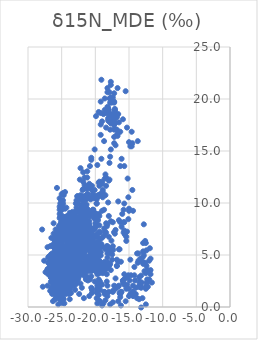
| Category | δ15N_MDE (‰) |
|---|---|
| -24.6 | 4.55 |
| -24.400000000000002 | 5.95 |
| -24.1 | 4.45 |
| -24.7 | 4.15 |
| -24.7 | 4.25 |
| -24.5 | 4.45 |
| -24.900000000000002 | 2.85 |
| -24.5 | 3.55 |
| -24.3 | 4.95 |
| -24.1 | 6.25 |
| -24.400000000000002 | 4.95 |
| -24.8 | 5.35 |
| -24.5 | 4.05 |
| -24.7 | 4.55 |
| -23.6 | 5.15 |
| -24.6 | 4.15 |
| -24.7 | 3.55 |
| -24.6 | 5.15 |
| -24.0 | 4.35 |
| -24.8 | 4.45 |
| -25.2 | 4.95 |
| -23.1 | 4.35 |
| -23.900000000000002 | 6.05 |
| -24.900000000000002 | 3.25 |
| -23.6 | 6.45 |
| -24.3 | 5.65 |
| -24.1 | 4.65 |
| -21.2 | 6.25 |
| -23.7 | 5.15 |
| -24.1 | 4.45 |
| -23.400000000000002 | 5.55 |
| -24.5 | 5.75 |
| -24.900000000000002 | 4.65 |
| -25.3 | 2.45 |
| -25.6 | 2.55 |
| -25.3 | 2.35 |
| -25.400000000000002 | 2.75 |
| -25.6 | 3.65 |
| -26.1 | 2.55 |
| -25.6 | 1.75 |
| -26.1 | 1.75 |
| -25.8 | 2.95 |
| -25.900000000000002 | 2.45 |
| -26.5 | 2.35 |
| -25.900000000000002 | 4.05 |
| -24.7 | 5.65 |
| -25.8 | 2.55 |
| -27.1 | 2.05 |
| -26.8 | 4.25 |
| -26.2 | 3.25 |
| -26.6 | 2.45 |
| -25.6 | 2.75 |
| -25.900000000000002 | 2.45 |
| -25.8 | 1.95 |
| -26.1 | 2.05 |
| -26.3 | 1.35 |
| -25.900000000000002 | 2.15 |
| -25.5 | 2.55 |
| -25.5 | 1.75 |
| -25.8 | 1.85 |
| -25.5 | 4.05 |
| -26.0 | 2.35 |
| -25.7 | 2.55 |
| -26.400000000000002 | 1.45 |
| -26.2 | 2.55 |
| -25.900000000000002 | 2.15 |
| -25.5 | 3.05 |
| -26.5 | 1.75 |
| -26.3 | 1.55 |
| -25.900000000000002 | 2.25 |
| -26.1 | 2.15 |
| -26.7 | 1.55 |
| -25.900000000000002 | 2.55 |
| -25.8 | 2.95 |
| -26.1 | 2.35 |
| -25.5 | 2.95 |
| -25.8 | 1.25 |
| -26.0 | 1.65 |
| -25.400000000000002 | 2.55 |
| -25.2 | 2.25 |
| -25.5 | 3.75 |
| -25.5 | 2.85 |
| -25.6 | 2.55 |
| -25.900000000000002 | 1.45 |
| -26.1 | 1.25 |
| -25.900000000000002 | 1.55 |
| -25.1 | 3.65 |
| -25.3 | 3.45 |
| -25.3 | 3.85 |
| -25.3 | 3.25 |
| -25.8 | 3.05 |
| -24.8 | 3.95 |
| -26.400000000000002 | 5.15 |
| -26.3 | 2.65 |
| -25.900000000000002 | 3.75 |
| -26.0 | 2.35 |
| -26.5 | 3.15 |
| -26.8 | 3.25 |
| -25.400000000000002 | 2.95 |
| -25.3 | 3.45 |
| -26.6 | 3.75 |
| -25.5 | 3.55 |
| -26.2 | 1.95 |
| -26.6 | 2.85 |
| -26.400000000000002 | 1.95 |
| -26.2 | 1.45 |
| -26.2 | 2.55 |
| -23.8 | 5.55 |
| -23.3 | 7.05 |
| -24.400000000000002 | 5.05 |
| -24.8 | 4.75 |
| -23.3 | 6.85 |
| -23.8 | 4.45 |
| -23.5 | 4.35 |
| -24.900000000000002 | 2.95 |
| -23.5 | 4.45 |
| -23.400000000000002 | 6.35 |
| -23.8 | 4.75 |
| -24.1 | 3.15 |
| -23.8 | 5.05 |
| -24.5 | 3.15 |
| -23.5 | 4.45 |
| -24.3 | 4.65 |
| -23.6 | 4.35 |
| -24.3 | 4.35 |
| -24.2 | 5.05 |
| -23.900000000000002 | 3.45 |
| -24.3 | 2.95 |
| -24.5 | 2.35 |
| -23.5 | 5.35 |
| -24.0 | 5.85 |
| -23.900000000000002 | 4.15 |
| -23.8 | 3.95 |
| -24.5 | 5.65 |
| -23.6 | 5.55 |
| -24.1 | 5.05 |
| -24.0 | 4.95 |
| -24.1 | 5.75 |
| -24.0 | 4.45 |
| -24.0 | 5.05 |
| -23.6 | 4.45 |
| -24.2 | 5.95 |
| -24.3 | 4.45 |
| -23.5 | 4.65 |
| -24.5 | 5.45 |
| -24.3 | 4.65 |
| -23.6 | 4.55 |
| -24.1 | 4.45 |
| -24.1 | 5.65 |
| -24.0 | 5.55 |
| -24.1 | 6.15 |
| -24.3 | 5.65 |
| -23.900000000000002 | 4.75 |
| -24.1 | 4.85 |
| -23.8 | 6.45 |
| -23.8 | 4.55 |
| -24.5 | 5.35 |
| -23.8 | 5.85 |
| -24.0 | 5.95 |
| -23.900000000000002 | 5.85 |
| -24.0 | 6.75 |
| -24.5 | 5.65 |
| -24.900000000000002 | 3.15 |
| -24.1 | 4.75 |
| -24.3 | 5.35 |
| -24.2 | 4.75 |
| -24.2 | 5.35 |
| -23.8 | 5.55 |
| -26.400000000000002 | 3.25 |
| -26.6 | 2.85 |
| -26.2 | 2.25 |
| -26.1 | 2.75 |
| -26.3 | 3.45 |
| -25.6 | 2.95 |
| -26.0 | 2.15 |
| -25.900000000000002 | 3.05 |
| -26.0 | 2.75 |
| -26.3 | 3.05 |
| -25.900000000000002 | 2.75 |
| -26.1 | 3.45 |
| -25.900000000000002 | 2.35 |
| -25.900000000000002 | 2.95 |
| -25.1 | 5.25 |
| -25.400000000000002 | 3.15 |
| -25.900000000000002 | 3.05 |
| -25.900000000000002 | 2.95 |
| -26.0 | 2.15 |
| -25.7 | 2.75 |
| -26.6 | 3.25 |
| -25.7 | 2.95 |
| -26.0 | 2.55 |
| -26.2 | 3.65 |
| -26.1 | 2.95 |
| -26.1 | 2.75 |
| -26.2 | 3.45 |
| -25.7 | 3.35 |
| -26.1 | 3.15 |
| -25.8 | 3.15 |
| -25.5 | 3.55 |
| -21.5 | 4.85 |
| -21.3 | 3.65 |
| -20.8 | 5.95 |
| -21.8 | 3.75 |
| -23.900000000000002 | 4.35 |
| -22.6 | 3.35 |
| -23.0 | 3.95 |
| -24.5 | 3.85 |
| -23.3 | 4.35 |
| -23.400000000000002 | 4.25 |
| -24.400000000000002 | 3.65 |
| -22.2 | 4.05 |
| -24.5 | 2.75 |
| -23.1 | 3.55 |
| -23.2 | 5.05 |
| -22.7 | 3.85 |
| -22.7 | 3.15 |
| -23.8 | 4.45 |
| -23.900000000000002 | 3.65 |
| -22.8 | 4.75 |
| -24.3 | 4.05 |
| -22.7 | 4.45 |
| -23.0 | 5.65 |
| -23.6 | 5.35 |
| -23.0 | 3.95 |
| -22.6 | 4.95 |
| -20.5 | 5.15 |
| -21.7 | 3.15 |
| -23.8 | 4.55 |
| -22.1 | 5.05 |
| -22.2 | 4.95 |
| -22.3 | 4.75 |
| -22.6 | 4.95 |
| -21.4 | 4.65 |
| -23.0 | 4.65 |
| -22.6 | 3.95 |
| -22.3 | 4.65 |
| -22.900000000000002 | 4.35 |
| -21.8 | 5.25 |
| -23.3 | 4.85 |
| -22.7 | 4.55 |
| -21.0 | 4.05 |
| -20.0 | 5.85 |
| -21.4 | 4.25 |
| -25.400000000000002 | 3.45 |
| -24.7 | 4.45 |
| -26.0 | 2.85 |
| -25.8 | 2.75 |
| -25.6 | 3.65 |
| -25.0 | 4.35 |
| -25.400000000000002 | 3.45 |
| -25.400000000000002 | 4.05 |
| -25.3 | 4.35 |
| -24.7 | 3.65 |
| -25.0 | 3.35 |
| -21.8 | 7.35 |
| -24.700000000000006 | 3.15 |
| -24.3 | 3.95 |
| -25.3 | 2.65 |
| -24.399999999999995 | 4.55 |
| -24.3 | 4.15 |
| -25.399999999999995 | 3.15 |
| -24.99999999999999 | 3.62 |
| -25.24 | 2.85 |
| -25.3 | 2.65 |
| -25.3 | 2.75 |
| -25.49999999999999 | 2.45 |
| -24.99999999999999 | 2.75 |
| -25.100000000000012 | 2.55 |
| -22.99999999999999 | 6.35 |
| -24.700000000000006 | 3.55 |
| -25.49999999999999 | 2.85 |
| -22.8 | 6.75 |
| -23.49999999999999 | 5.75 |
| -23.700000000000006 | 6.05 |
| -22.8 | 6.55 |
| -23.100000000000012 | 6.15 |
| -23.209999999999997 | 6.69 |
| -22.700000000000006 | 6.45 |
| -23.3 | 6.05 |
| -24.899999999999995 | 3.95 |
| -24.8 | 3.95 |
| -24.49999999999999 | 3.55 |
| -25.600000000000012 | 3.05 |
| -24.49999999999999 | 4.05 |
| -24.399999999999995 | 4.05 |
| -25.100000000000012 | 4.25 |
| -22.3 | 6.55 |
| -22.600000000000012 | 6.65 |
| -22.600000000000012 | 6.65 |
| -23.399999999999995 | 6.05 |
| -22.3 | 6.95 |
| -22.99999999999999 | 5.65 |
| -23.100000000000012 | 5.95 |
| -21.899999999999995 | 6.45 |
| -22.600000000000012 | 5.85 |
| -23.700000000000006 | 5.55 |
| -22.600000000000012 | 5.95 |
| -22.99999999999999 | 6.05 |
| -25.1 | 6.65 |
| -25.3 | 9.35 |
| -25.3 | 9.65 |
| -24.8 | 10.25 |
| -24.7 | 10.75 |
| -24.3 | 9.55 |
| -22.8 | 10.25 |
| -25.1 | 9.25 |
| -24.6 | 7.65 |
| -24.8 | 8.05 |
| -25.1 | 3.55 |
| -24.900000000000002 | 9.85 |
| -24.900000000000002 | 8.25 |
| -25.1 | 10.25 |
| -24.8 | 9.95 |
| -25.2 | 9.95 |
| -25.1 | 7.45 |
| -25.1 | 9.75 |
| -24.900000000000002 | 9.45 |
| -24.2 | 8.25 |
| -24.6 | 8.15 |
| -24.8 | 4.75 |
| -25.3 | 8.55 |
| -24.5 | 9.45 |
| -25.0 | 10.85 |
| -24.900000000000002 | 7.85 |
| -25.3 | 10.45 |
| -25.7 | 11.45 |
| -25.3 | 8.95 |
| -24.8 | 10.95 |
| -24.7 | 7.95 |
| -24.3 | 5.25 |
| -24.3 | 4.65 |
| -24.400000000000002 | 5.35 |
| -24.400000000000002 | 5.25 |
| -24.5 | 4.45 |
| -24.400000000000002 | 3.45 |
| -23.8 | 5.25 |
| -24.5 | 4.55 |
| -23.900000000000002 | 4.85 |
| -23.8 | 4.75 |
| -23.900000000000002 | 4.65 |
| -22.1 | 10.55 |
| -23.6 | 5.55 |
| -22.8 | 7.75 |
| -24.7 | 5.35 |
| -23.1 | 8.15 |
| -21.6 | 6.15 |
| -25.6 | 3.65 |
| -23.900000000000002 | 5.45 |
| -22.400000000000002 | 6.05 |
| -23.5 | 4.25 |
| -24.6 | 4.05 |
| -25.1 | 4.95 |
| -25.0 | 4.75 |
| -24.6 | 4.25 |
| -25.0 | 4.75 |
| -24.2 | 4.45 |
| -21.6 | 5.45 |
| -23.1 | 6.15 |
| -24.6 | 4.45 |
| -23.400000000000002 | 4.55 |
| -24.400000000000002 | 3.85 |
| -24.1 | 3.25 |
| -24.900000000000002 | 4.25 |
| -24.8 | 5.15 |
| -24.3 | 4.95 |
| -24.6 | 5.35 |
| -24.7 | 4.65 |
| -22.1 | 5.75 |
| -21.0 | 6.25 |
| -22.400000000000002 | 5.95 |
| -22.5 | 5.95 |
| -22.7 | 5.95 |
| -21.6 | 5.65 |
| -23.400000000000002 | 8.45 |
| -22.900000000000002 | 7.35 |
| -23.7 | 6.15 |
| -20.0 | 4.95 |
| -24.0 | 5.15 |
| -23.900000000000002 | 5.65 |
| -23.900000000000002 | 5.25 |
| -24.2 | 4.45 |
| -24.3 | 5.25 |
| -25.1 | 3.25 |
| -23.1 | 5.55 |
| -24.1 | 4.25 |
| -24.5 | 2.35 |
| -24.6 | 1.95 |
| -24.2 | 5.55 |
| -24.7 | 4.05 |
| -24.3 | 5.25 |
| -24.6 | 5.05 |
| -22.6 | 4.55 |
| -23.900000000000002 | 5.25 |
| -24.900000000000002 | 3.05 |
| -24.3 | 4.85 |
| -24.5 | 11.05 |
| -24.3 | 3.35 |
| -24.900000000000002 | 1.85 |
| -24.400000000000002 | 3.15 |
| -25.6 | 2.45 |
| -24.400000000000002 | 3.05 |
| -24.400000000000002 | 2.35 |
| -24.900000000000002 | 2.25 |
| -24.900000000000002 | 2.05 |
| -24.400000000000002 | 2.55 |
| -24.1 | 2.55 |
| -24.6 | 2.45 |
| -24.5 | 1.75 |
| -24.6 | 1.45 |
| -24.7 | 2.45 |
| -24.900000000000002 | 1.45 |
| -25.3 | 1.15 |
| -24.8 | 2.05 |
| -24.5 | 2.65 |
| -25.3 | 1.05 |
| -24.5 | 2.55 |
| -24.5 | 3.15 |
| -24.6 | 3.15 |
| -24.3 | 2.05 |
| -24.3 | 2.05 |
| -24.6 | 2.85 |
| -24.400000000000002 | 2.95 |
| -24.2 | 2.15 |
| -24.7 | 2.55 |
| -24.2 | 2.05 |
| -24.6 | 1.85 |
| -23.900000000000002 | 2.85 |
| -24.5 | 3.05 |
| -24.2 | 3.35 |
| -24.6 | 2.55 |
| -25.0 | 1.45 |
| -25.2 | 1.15 |
| -25.1 | 0.85 |
| -24.3 | 2.35 |
| -25.0 | 0.85 |
| -24.900000000000002 | 1.55 |
| -24.900000000000002 | 1.45 |
| -24.7 | 1.35 |
| -24.2 | 1.65 |
| -24.900000000000002 | 1.35 |
| -25.0 | 1.05 |
| -25.1 | 1.95 |
| -24.900000000000002 | 1.65 |
| -24.2 | 3.25 |
| -25.983 | 0.732 |
| -25.888 | 0.822 |
| -24.914 | 0.397 |
| -25.689 | 1.029 |
| -25.707 | 1.113 |
| -25.595000000000002 | 1.122 |
| -25.71 | 1.304 |
| -25.715 | 1.376 |
| -25.684 | 1.447 |
| -25.607 | 1.526 |
| -25.603 | 1.414 |
| -25.802 | 1.637 |
| -25.416 | 2.223 |
| -25.7 | 2.323 |
| -25.201 | 2.51 |
| -25.121000000000002 | 3.051 |
| -25.017 | 3.157 |
| -25.021 | 3.372 |
| -25.012 | 3.444 |
| -24.797 | 3.354 |
| -24.797 | 3.465 |
| -24.921 | 3.651 |
| -24.702 | 3.656 |
| -24.609 | 3.656 |
| -24.698 | 3.877 |
| -24.709 | 3.95 |
| -25.098 | 3.775 |
| -25.112000000000002 | 3.866 |
| -25.024 | 3.864 |
| -25.01 | 4.075 |
| -24.918 | 4.241 |
| -24.605 | 4.256 |
| -24.712 | 4.577 |
| -24.61 | 4.87 |
| -24.413 | 4.765 |
| -24.918 | 4.963 |
| -24.92 | 5.343 |
| -24.793 | 5.566 |
| -24.705000000000002 | 5.469 |
| -24.503 | 5.67 |
| -25.119 | 6.579 |
| -25.21 | 6.872 |
| -25.305 | 7.85 |
| -25.106 | 7.593 |
| -24.91 | 7.584 |
| -24.007 | 7.763 |
| -24.425 | 8.564 |
| -25.21 | 8.683 |
| -24.87 | 4.85 |
| -25.41 | 3.04 |
| -25.580000000000002 | 2.56 |
| -23.68 | 6.1 |
| -25.51 | 4.29 |
| -25.27 | 4.15 |
| -25.44 | 4.45 |
| -25.29 | 4.28 |
| -24.470000000000002 | 4.78 |
| -25.240000000000002 | 5.03 |
| -25.18 | 5.74 |
| -25.25 | 5.13 |
| -25.91 | 3.6 |
| -25.32 | 4.22 |
| -25.77 | 4.03 |
| -25.51 | 5.22 |
| -26.14 | 2.76 |
| -25.560000000000002 | 2.83 |
| -25.66 | 2.91 |
| -25.25 | 4.18 |
| -26.29 | 0.56 |
| -25.29 | 5.43 |
| -25.86 | 2.22 |
| -26.240000000000002 | 2.77 |
| -26.14 | 1.97 |
| -24.970000000000002 | 5.24 |
| -25.970000000000002 | 2.91 |
| -26.27 | 2.38 |
| -25.14 | 3.99 |
| -25.57 | 3.49 |
| -24.95 | 5.72 |
| -26.14 | 4.86 |
| -25.32 | 3.66 |
| -26.55 | -1.97 |
| -26.73 | -1.44 |
| -25.13 | 2.99 |
| -25.32 | 2.72 |
| -25.54 | 2.11 |
| -25.67 | 2.72 |
| -24.810000000000002 | 3.09 |
| -25.04 | 3.14 |
| -25.21 | 1.98 |
| -25.89 | 1.55 |
| -25.5 | 3.61 |
| -24.5 | 3.38 |
| -25.39 | 1.78 |
| -25.14 | 3 |
| -25.05 | 3.24 |
| -25.560000000000002 | 3.72 |
| -25.25 | 3.42 |
| -25.5 | 2.23 |
| -26.95 | -1.07 |
| -25.29 | 2.05 |
| -25.38 | 2.96 |
| -25.2 | 4.42 |
| -25.810000000000002 | 3.25 |
| -24.98 | 3.2 |
| -25.53 | 2.16 |
| -25.66 | 3.69 |
| -24.95 | 3.98 |
| -24.94 | 3.6 |
| -25.16 | 4.18 |
| -25.62 | 2.57 |
| -24.990000000000002 | 3.28 |
| -25.17 | 3.27 |
| -25.45 | 3.37 |
| -25.19 | 3.43 |
| -25.23 | 2.57 |
| -25.6 | 3.05 |
| -25.2 | 4.45 |
| -25.7 | 3.35 |
| -25.5 | 3.15 |
| -25.6 | 3.35 |
| -25.1 | 2.95 |
| -25.1 | 3.05 |
| -24.900000000000002 | 3.05 |
| -25.3 | 3.25 |
| -25.7 | 4.25 |
| -25.400000000000002 | 3.65 |
| -25.0 | 2.95 |
| -25.2 | 2.85 |
| -25.5 | 2.65 |
| -24.8 | 3.95 |
| -25.1 | 2.55 |
| -24.3 | 2.75 |
| -24.7 | 3.75 |
| -24.7 | 3.35 |
| -23.6 | 2.05 |
| -24.3 | 2.35 |
| -23.7 | 2.75 |
| -23.2 | 2.55 |
| -25.1 | 5.75 |
| -24.7 | 2.25 |
| -24.900000000000002 | 3.65 |
| -23.7 | 2.05 |
| -24.400000000000002 | 2.05 |
| -23.3 | 3.65 |
| -22.7 | 4.05 |
| -22.1 | 4.25 |
| -23.400000000000002 | 4.05 |
| -22.6 | 3.95 |
| -23.900000000000002 | 3.25 |
| -24.2 | 3.65 |
| -23.8 | 4.75 |
| -22.3 | 3.95 |
| -24.3 | 3.85 |
| -23.1 | 3.75 |
| -22.8 | 4.25 |
| -24.1 | 2.75 |
| -23.1 | 2.85 |
| -26.8 | 4.35 |
| -23.0 | 3.85 |
| -22.0 | 3.55 |
| -22.5 | 4.55 |
| -23.5 | 3.85 |
| -23.900000000000002 | 3.75 |
| -24.1 | 3.45 |
| -22.7 | 2.95 |
| -24.3 | 2.75 |
| -22.7 | 3.05 |
| -23.3 | 3.45 |
| -23.5 | 3.25 |
| -25.2 | 2.35 |
| -25.6 | 2.35 |
| -25.2 | 2.75 |
| -22.900000000000002 | 2.85 |
| -25.1 | 2.95 |
| -25.2 | 1.05 |
| -25.7 | 2.35 |
| -25.2 | 2.75 |
| -25.3 | 2.45 |
| -25.1 | 2.85 |
| -25.1 | 2.45 |
| -23.3 | 3.05 |
| -25.400000000000002 | 3.75 |
| -24.900000000000002 | 4.15 |
| -24.900000000000002 | 3.95 |
| -23.6 | 2.95 |
| -25.0 | 2.45 |
| -24.1 | 2.45 |
| -25.0 | 2.75 |
| -24.5 | 3.15 |
| -25.1 | 2.65 |
| -24.8 | 4.65 |
| -25.400000000000002 | 2.05 |
| -23.6 | 3.65 |
| -23.7 | 1.75 |
| -23.1 | 3.75 |
| -24.2 | 3.35 |
| -23.900000000000002 | 3.55 |
| -23.5 | 4.05 |
| -23.8 | 2.65 |
| -24.2 | 2.95 |
| -23.900000000000002 | 2.25 |
| -24.400000000000002 | 3.35 |
| -24.5 | 2.85 |
| -24.2 | 3.85 |
| -24.2 | 2.65 |
| -24.1 | 3.75 |
| -26.3 | 4.15 |
| -24.7 | 4.05 |
| -22.1 | 4.25 |
| -22.5 | 2.85 |
| -25.0 | 5.05 |
| -24.900000000000002 | 5.25 |
| -24.7 | 4.15 |
| -24.3 | 5.45 |
| -22.0 | 4.05 |
| -22.3 | 3.45 |
| -16.8 | 3.95 |
| -23.8 | 4.55 |
| -22.400000000000002 | 4.75 |
| -21.4 | 2.75 |
| -24.6 | 3.15 |
| -22.3 | 3.05 |
| -24.6 | -0.45 |
| -24.5 | 1.85 |
| -25.1 | 2.75 |
| -24.8 | 1.35 |
| -24.1 | 2.25 |
| -25.3 | 2.25 |
| -25.2 | 0.65 |
| -23.900000000000002 | 3.25 |
| -24.900000000000002 | 1.95 |
| -24.8 | 5.45 |
| -25.0 | 1.35 |
| -25.2 | 1.75 |
| -24.6 | 4.55 |
| -23.900000000000002 | 2.65 |
| -25.1 | 1.45 |
| -25.1 | 2.85 |
| -25.400000000000002 | 1.55 |
| -25.1 | 1.35 |
| -24.0 | 1.75 |
| -25.2 | 1.25 |
| -24.8 | 2.05 |
| -25.1 | 3.85 |
| -22.7 | 5.05 |
| -25.400000000000002 | 2.35 |
| -24.5 | -0.25 |
| -23.7 | 3.25 |
| -24.8 | 0.85 |
| -24.900000000000002 | 1.95 |
| -24.5 | 3.45 |
| -24.900000000000002 | 1.25 |
| -25.0 | 5.65 |
| -25.1 | 2.75 |
| -25.0 | 1.85 |
| -25.0 | 2.25 |
| -25.0 | 1.75 |
| -25.0 | 3.35 |
| -25.0 | 5.15 |
| -25.2 | 2.25 |
| -25.3 | 2.35 |
| -24.5 | 2.45 |
| -24.900000000000002 | 1.85 |
| -25.8 | 3.35 |
| -24.8 | 2.95 |
| -25.2 | 2.35 |
| -25.0 | 1.75 |
| -25.5 | 1.55 |
| -25.5 | 2.05 |
| -24.6 | 3.25 |
| -23.6 | 4.05 |
| -23.900000000000002 | 3.65 |
| -24.6 | 3.55 |
| -24.1 | 3.15 |
| -24.2 | 3.25 |
| -24.1 | 3.75 |
| -24.3 | 3.55 |
| -24.0 | 3.15 |
| -23.7 | 4.05 |
| -23.8 | 3.25 |
| -24.1 | 3.35 |
| -24.0 | 3.35 |
| -23.7 | 3.25 |
| -24.0 | 3.45 |
| -24.0 | 3.65 |
| -24.3 | 3.15 |
| -24.2 | 3.75 |
| -23.900000000000002 | 3.35 |
| -24.1 | 3.85 |
| -24.5 | 3.45 |
| -23.8 | 3.75 |
| -23.6 | 3.45 |
| -23.900000000000002 | 3.25 |
| -24.0 | 3.35 |
| -23.8 | 3.05 |
| -24.1 | 3.85 |
| -24.3 | 3.45 |
| -25.5 | 2.85 |
| -25.1 | 1.45 |
| -24.0 | 4.35 |
| -24.8 | 3.55 |
| -23.400000000000002 | 7.15 |
| -24.1 | 2.15 |
| -25.2 | 1.55 |
| -24.400000000000002 | 3.75 |
| -24.8 | 3.55 |
| -25.8 | 2.25 |
| -25.400000000000002 | 2.25 |
| -24.7 | 2.85 |
| -24.8 | 1.65 |
| -24.400000000000002 | 2.95 |
| -24.400000000000002 | 3.15 |
| -25.0 | 1.85 |
| -25.1 | 2.85 |
| -25.0 | 2.35 |
| -24.900000000000002 | 3.15 |
| -25.0 | 2.85 |
| -24.5 | 3.15 |
| -23.900000000000002 | 2.65 |
| -25.0 | 3.25 |
| -24.6 | 2.55 |
| -24.6 | 2.95 |
| -24.8 | 2.35 |
| -23.8 | 3.55 |
| -24.5 | 3.65 |
| -24.8 | 2.15 |
| -24.400000000000002 | 2.45 |
| -24.5 | 2.45 |
| -24.400000000000002 | 2.25 |
| -24.900000000000002 | 2.55 |
| -24.400000000000002 | 1.25 |
| -24.6 | 2.35 |
| -24.8 | 2.95 |
| -24.5 | 3.35 |
| -24.400000000000002 | 3.45 |
| -24.3 | 4.55 |
| -24.5 | 2.85 |
| -24.0 | 4.85 |
| -24.7 | 2.15 |
| -24.900000000000002 | 2.95 |
| -24.900000000000002 | 2.75 |
| -24.900000000000002 | 3.05 |
| -24.900000000000002 | 2.65 |
| -24.7 | 2.55 |
| -25.0 | 1.75 |
| -25.2 | 2.55 |
| -24.2 | 4.05 |
| -24.8 | 2.45 |
| -25.1 | 2.75 |
| -25.0 | 4.65 |
| -24.3 | 3.05 |
| -24.900000000000002 | 2.15 |
| -24.5 | 4.75 |
| -24.5 | 4.65 |
| -24.7 | 3.55 |
| -25.2 | 2.85 |
| -25.0 | 3.45 |
| -25.3 | 3.15 |
| -24.7 | 2.45 |
| -25.1 | 3.05 |
| -25.3 | 3.35 |
| -25.3 | 3.05 |
| -24.6 | 3.75 |
| -25.2 | 2.85 |
| -14.8 | 1.25 |
| -14.399999999999999 | 1.05 |
| -13.5 | 0.75 |
| -13.1 | 2.35 |
| -14.0 | 1.25 |
| -13.399999999999999 | 1.95 |
| -12.5 | 0.25 |
| -12.5 | -0.25 |
| -13.0 | -0.45 |
| -12.899999999999999 | -0.35 |
| -14.399999999999999 | -0.45 |
| -11.8 | 3.55 |
| -12.3 | 2.65 |
| -13.8 | 0.85 |
| -19.5 | 0.65 |
| -11.6 | 2.35 |
| -12.5 | 1.75 |
| -16.2 | 4.35 |
| -12.6 | 6.35 |
| -14.8 | 4.55 |
| -12.899999999999999 | 5.35 |
| -12.8 | 7.95 |
| -12.1 | 2.45 |
| -13.399999999999999 | 2.25 |
| -14.0 | 1.85 |
| -14.899999999999999 | 2.55 |
| -13.399999999999999 | 2.45 |
| -15.899999999999999 | 2.35 |
| -15.0 | 1.75 |
| -11.8 | 4.65 |
| -12.2 | 1.95 |
| -12.399999999999999 | 2.05 |
| -14.399999999999999 | 2.05 |
| -13.6 | 1.95 |
| -13.0 | 0.85 |
| -12.0 | 2.65 |
| -24.0 | 6.65 |
| -24.2 | 6.65 |
| -23.0 | 5.65 |
| -22.799999999999997 | 5.05 |
| -23.299999999999997 | 5.55 |
| -23.099999999999998 | 5.65 |
| -19.2 | 5.85 |
| -19.4 | 5.85 |
| -21.2 | 4.25 |
| -21.299999999999997 | 4.35 |
| -19.2 | 4.95 |
| -19.8 | 4.75 |
| -19.5 | 5.65 |
| -19.8 | 5.45 |
| -20.0 | 4.95 |
| -19.599999999999998 | 5.35 |
| -19.9 | 4.95 |
| -19.599999999999998 | 4.85 |
| -20.0 | 5.05 |
| -19.8 | 4.95 |
| -20.2 | 4.75 |
| -19.9 | 4.45 |
| -21.0 | 4.65 |
| -20.799999999999997 | 4.55 |
| -19.9 | 5.55 |
| -17.4 | 5.55 |
| -17.4 | 5.85 |
| -19.7 | 4.55 |
| -19.3 | 4.35 |
| -17.9 | 5.65 |
| -18.3 | 5.85 |
| -23.0 | 5.25 |
| -23.0 | 5.65 |
| -23.0 | 6.05 |
| -23.099999999999998 | 6.55 |
| -22.299999999999997 | 6.15 |
| -25.0 | 3.75 |
| -26.2 | 3.45 |
| -24.6 | 2.75 |
| -26.7 | 3.55 |
| -25.6 | 3.15 |
| -24.2 | 5.25 |
| -25.2 | 3.05 |
| -26.0 | 4.65 |
| -26.7 | 4.05 |
| -27.0 | 4.75 |
| -25.400000000000002 | 3.75 |
| -25.2 | 4.45 |
| -25.5 | 3.15 |
| -25.2 | 3.05 |
| -26.1 | 4.05 |
| -25.400000000000002 | 4.05 |
| -25.1 | 4.15 |
| -25.1 | 5.75 |
| -27.400000000000002 | 3.35 |
| -25.3 | 3.75 |
| -25.1 | 2.45 |
| -25.3 | 2.75 |
| -25.400000000000002 | 4.55 |
| -25.6 | 3.95 |
| -26.400000000000002 | 4.45 |
| -25.8 | 3.55 |
| -26.0 | 3.25 |
| -25.2 | 2.75 |
| -23.6 | 4.45 |
| -24.900000000000002 | 3.85 |
| -25.7 | 3.55 |
| -25.3 | 3.45 |
| -25.3 | 3.65 |
| -25.2 | 4.05 |
| -25.2 | 2.05 |
| -25.6 | 3.15 |
| -25.8 | 2.15 |
| -25.5 | 3.15 |
| -25.400000000000002 | 2.75 |
| -25.3 | 2.75 |
| -25.0 | 1.25 |
| -25.400000000000002 | 3.15 |
| -25.6 | 1.85 |
| -25.5 | 1.85 |
| -25.3 | 2.55 |
| -25.2 | 2.95 |
| -24.5 | 3.15 |
| -25.400000000000002 | 3.75 |
| -25.3 | 3.25 |
| -26.1 | 2.55 |
| -25.1 | 3.55 |
| -25.400000000000002 | 2.85 |
| -25.8 | 2.45 |
| -24.900000000000002 | 2.85 |
| -24.8 | 5.15 |
| -25.7 | 2.55 |
| -25.3 | 2.65 |
| -25.900000000000002 | 3.35 |
| -25.400000000000002 | 2.65 |
| -25.5 | 3.45 |
| -25.900000000000002 | 3.25 |
| -26.1 | 3.35 |
| -27.0 | 4.25 |
| -25.0 | 4.85 |
| -25.400000000000002 | 2.65 |
| -26.2 | 4.55 |
| -25.2 | 2.75 |
| -26.8 | 3.65 |
| -25.7 | 3.15 |
| -25.7 | 2.95 |
| -25.400000000000002 | 3.85 |
| -25.6 | 6.35 |
| -25.5 | 3.25 |
| -26.900000000000002 | 4.25 |
| -25.7 | 2.35 |
| -25.6 | 3.45 |
| -27.1 | 3.55 |
| -25.0 | 2.35 |
| -25.900000000000002 | 3.75 |
| -26.400000000000002 | 3.85 |
| -25.0 | 3.45 |
| -26.3 | 3.25 |
| -26.1 | 1.75 |
| -25.400000000000002 | 3.25 |
| -25.3 | 3.75 |
| -27.0 | 3.15 |
| -25.3 | 2.75 |
| -26.3 | 3.05 |
| -25.5 | 2.05 |
| -25.1 | 1.95 |
| -25.5 | 6.15 |
| -25.8 | 2.35 |
| -25.7 | 2.95 |
| -25.2 | 2.85 |
| -25.900000000000002 | 1.45 |
| -25.2 | 3.25 |
| -25.5 | 4.25 |
| -25.6 | 1.55 |
| -26.5 | 4.65 |
| -25.8 | 4.55 |
| -25.5 | 3.45 |
| -25.6 | 2.85 |
| -25.2 | 3.85 |
| -25.400000000000002 | 3.45 |
| -26.2 | 3.65 |
| -24.900000000000002 | 3.65 |
| -25.900000000000002 | 2.85 |
| -25.400000000000002 | 2.65 |
| -25.7 | 2.75 |
| -26.3 | 3.25 |
| -26.7 | 3.05 |
| -25.900000000000002 | 1.95 |
| -25.900000000000002 | 2.45 |
| -25.400000000000002 | 2.45 |
| -25.3 | 3.15 |
| -25.5 | 3.55 |
| -25.900000000000002 | 1.65 |
| -25.7 | 2.25 |
| -25.3 | 5.25 |
| -25.6 | 3.75 |
| -25.7 | 2.95 |
| -26.0 | 3.65 |
| -25.400000000000002 | 2.15 |
| -25.5 | 2.55 |
| -27.0 | 3.65 |
| -25.0 | 4.55 |
| -25.6 | 3.55 |
| -25.400000000000002 | 3.35 |
| -25.400000000000002 | 3.65 |
| -25.7 | 3.35 |
| -25.400000000000002 | 4.15 |
| -25.400000000000002 | 3.45 |
| -25.400000000000002 | 3.75 |
| -27.6 | 4.45 |
| -24.400000000000002 | 4.55 |
| -25.2 | 4.25 |
| -25.6 | 3.55 |
| -26.5 | 4.25 |
| -25.6 | 5.25 |
| -25.7 | 3.55 |
| -25.3 | 2.65 |
| -26.0 | 2.95 |
| -25.3 | 3.35 |
| -25.6 | 3.25 |
| -25.5 | 4.45 |
| -25.6 | 2.95 |
| -26.2 | 3.75 |
| -25.6 | 3.15 |
| -25.400000000000002 | 2.65 |
| -26.0 | 4.35 |
| -26.2 | 4.45 |
| -25.5 | 4.55 |
| -23.400000000000002 | 7.85 |
| -24.8 | 3.95 |
| -26.0 | 3.55 |
| -25.400000000000002 | 3.35 |
| -24.900000000000002 | 1.95 |
| -25.5 | 3.65 |
| -25.5 | 3.95 |
| -26.7 | 4.05 |
| -24.8 | 3.55 |
| -24.8 | 4.95 |
| -24.8 | 3.95 |
| -25.8 | 3.95 |
| -25.8 | 3.95 |
| -25.400000000000002 | 3.95 |
| -26.1 | 2.85 |
| -25.8 | 2.65 |
| -25.400000000000002 | 1.75 |
| -25.3 | 3.85 |
| -25.7 | 3.15 |
| -25.7 | 2.95 |
| -27.1 | 3.65 |
| -25.400000000000002 | 4.65 |
| -26.1 | 3.25 |
| -25.400000000000002 | 2.75 |
| -25.7 | 3.15 |
| -26.0 | 3.25 |
| -26.0 | 4.65 |
| -25.2 | 5.15 |
| -26.1 | 2.85 |
| -26.1 | 2.45 |
| -26.5 | 1.75 |
| -26.3 | 2.95 |
| -25.0 | 3.85 |
| -25.3 | 4.15 |
| -25.0 | 1.95 |
| -24.900000000000002 | 5.75 |
| -24.900000000000002 | 5.75 |
| -26.0 | 3.15 |
| -25.400000000000002 | 3.85 |
| -25.7 | 2.45 |
| -26.3 | 4.45 |
| -26.400000000000002 | 3.55 |
| -25.400000000000002 | 4.75 |
| -25.1 | 3.75 |
| -25.6 | 3.35 |
| -25.5 | 3.15 |
| -26.6 | 3.25 |
| -25.1 | 2.45 |
| -25.8 | 3.95 |
| -25.2 | 5.65 |
| -25.400000000000002 | 4.25 |
| -27.2 | -0.15 |
| -26.0 | 3.65 |
| -17.9 | 13.85 |
| -18.6 | 12.35 |
| -20.1 | 9.05 |
| -20.4 | 9.35 |
| -19.5 | 11.95 |
| -20.5 | 9.15 |
| -19.3 | 10.85 |
| -18.4 | 12.45 |
| -18.5 | 12.75 |
| -20.1 | 15.15 |
| -19.4 | 11.65 |
| -19.6 | 10.75 |
| -20.3 | 9.35 |
| -18.9 | 11.05 |
| -18.9 | 10.55 |
| -21.2 | 9.35 |
| -22.2 | 8.05 |
| -20.6 | 9.05 |
| -15.399999999999999 | 6.35 |
| -20.5 | 7.25 |
| -13.6 | 4.45 |
| -22.900000000000002 | 3.75 |
| -22.900000000000002 | 7.55 |
| -21.900000000000002 | 8.55 |
| -20.1 | 7.65 |
| -20.2 | 8.55 |
| -21.3 | 8.75 |
| -20.7 | 10.45 |
| -13.8 | 5.15 |
| -20.2 | 6.85 |
| -19.8 | 8.75 |
| -24.900000000000002 | 5.85 |
| -26.900000000000002 | 4.85 |
| -21.2 | 9.45 |
| -21.3 | 8.75 |
| -20.7 | 10.35 |
| -21.6 | 8.55 |
| -20.3 | 8.95 |
| -21.5 | 8.95 |
| -22.6 | 6.65 |
| -19.5 | 6.25 |
| -21.900000000000002 | 5.65 |
| -22.3 | 5.05 |
| -22.5 | 6.15 |
| -21.7 | 6.85 |
| -22.2 | 7.05 |
| -22.2 | 6.35 |
| -22.0 | 7.15 |
| -22.7 | 2.65 |
| -22.400000000000002 | 6.35 |
| -22.0 | 6.55 |
| -18.6 | 3.55 |
| -14.399999999999999 | 1.45 |
| -22.0 | 8.05 |
| -21.8 | 6.25 |
| -22.7 | 6.45 |
| -22.400000000000002 | 7.35 |
| -22.5 | 6.65 |
| -22.400000000000002 | 6.15 |
| -22.5 | 3.85 |
| -19.7 | 5.85 |
| -21.7 | 8.05 |
| -24.6 | 3.85 |
| -18.2 | 7.95 |
| -22.0 | 5.25 |
| -16.3 | 1.25 |
| -22.0 | 4.75 |
| -22.0 | 6.35 |
| -22.2 | 6.35 |
| -22.2 | 6.55 |
| -19.9 | 5.65 |
| -23.400000000000002 | 6.05 |
| -22.6 | 5.85 |
| -22.5 | 7.35 |
| -22.3 | 6.65 |
| -19.9 | 5.15 |
| -21.8 | 6.55 |
| -21.8 | 6.75 |
| -15.899999999999999 | 2.55 |
| -19.9 | 4.45 |
| -21.6 | 6.25 |
| -22.3 | 5.15 |
| -21.4 | 7.65 |
| -20.0 | 5.95 |
| -22.900000000000002 | 6.15 |
| -21.1 | 6.75 |
| -21.0 | 7.95 |
| -22.0 | 6.55 |
| -20.7 | 7.25 |
| -22.5 | 6.25 |
| -22.6 | 6.15 |
| -21.4 | 6.45 |
| -22.0 | 6.65 |
| -22.0 | 6.15 |
| -22.6 | 5.55 |
| -22.5 | 5.85 |
| -21.900000000000002 | 7.85 |
| -22.2 | 7.65 |
| -22.8 | 5.25 |
| -21.7 | 6.45 |
| -20.5 | 4.35 |
| -21.8 | 6.45 |
| -22.2 | 6.85 |
| -22.2 | 6.95 |
| -20.9 | 1.05 |
| -15.0 | 1.05 |
| -21.900000000000002 | 8.15 |
| -19.9 | 4.65 |
| -22.900000000000002 | 5.45 |
| -21.8 | 7.35 |
| -22.400000000000002 | 5.75 |
| -21.900000000000002 | 5.45 |
| -21.6 | 5.85 |
| -22.6 | 6.35 |
| -25.3 | 2.85 |
| -20.6 | 6.95 |
| -21.6 | 5.95 |
| -16.2 | 0.15 |
| -21.8 | 5.05 |
| -21.7 | 7.05 |
| -22.3 | 6.15 |
| -22.400000000000002 | 6.75 |
| -19.7 | 6.25 |
| -23.5 | 5.55 |
| -23.5 | 4.25 |
| -21.900000000000002 | 6.85 |
| -23.0 | 5.35 |
| -20.9 | 6.55 |
| -21.7 | 7.15 |
| -22.400000000000002 | 4.05 |
| -18.1 | 5.75 |
| -22.3 | 5.85 |
| -22.400000000000002 | 4.95 |
| -21.900000000000002 | 4.05 |
| -20.9 | 6.65 |
| -20.4 | 5.65 |
| -24.1 | 4.15 |
| -19.8 | 4.85 |
| -20.7 | 7.25 |
| -22.6 | 6.45 |
| -21.7 | 6.75 |
| -22.3 | 5.05 |
| -24.6 | 6.65 |
| -21.7 | 6.85 |
| -22.2 | 6.35 |
| -22.0 | 7.15 |
| -22.7 | 2.65 |
| -22.400000000000002 | 6.35 |
| -22.0 | 6.55 |
| -18.6 | 3.55 |
| -14.399999999999999 | 1.45 |
| -22.0 | 8.05 |
| -21.8 | 6.25 |
| -22.400000000000002 | 7.35 |
| -22.5 | 3.85 |
| -19.7 | 5.85 |
| -24.6 | 3.85 |
| -16.3 | 1.25 |
| -22.0 | 4.75 |
| -19.9 | 5.65 |
| -23.400000000000002 | 6.05 |
| -22.6 | 5.85 |
| -22.5 | 7.35 |
| -19.9 | 5.15 |
| -21.8 | 6.55 |
| -21.8 | 6.75 |
| -15.899999999999999 | 2.55 |
| -21.6 | 6.25 |
| -22.3 | 5.15 |
| -20.0 | 5.95 |
| -21.1 | 6.75 |
| -21.0 | 7.95 |
| -21.7 | 8.05 |
| -21.4 | 7.65 |
| -22.900000000000002 | 6.15 |
| -20.7 | 7.25 |
| -25.1 | 8.15 |
| -21.2 | 9.35 |
| -21.1 | 7.65 |
| -24.400000000000002 | 6.85 |
| -20.1 | 7.45 |
| -25.1 | 7.85 |
| -23.5 | 8.05 |
| -24.900000000000002 | 8.65 |
| -23.400000000000002 | 7.95 |
| -24.1 | 8.25 |
| -18.1 | 10.05 |
| -22.3 | 7.75 |
| -24.5 | 7.35 |
| -24.5 | 7.85 |
| -24.1 | 7.55 |
| -25.0 | 6.55 |
| -24.5 | 7.95 |
| -24.2 | 8.75 |
| -22.1 | 8.95 |
| -23.900000000000002 | 8.65 |
| -17.7 | 8.25 |
| -24.5 | 7.05 |
| -23.900000000000002 | 8.05 |
| -22.1 | 7.85 |
| -25.400000000000002 | 7.25 |
| -24.400000000000002 | 8.65 |
| -23.7 | 6.85 |
| -23.5 | 8.25 |
| -23.1 | 7.45 |
| -23.3 | 7.45 |
| -24.1 | 7.55 |
| -23.3 | 7.95 |
| -23.900000000000002 | 7.75 |
| -23.400000000000002 | 7.65 |
| -22.8 | 8.15 |
| -24.2 | 8.15 |
| -23.2 | 6.45 |
| -25.7 | 6.75 |
| -24.2 | 6.35 |
| -25.400000000000002 | 7.75 |
| -23.0 | 8.55 |
| -23.5 | 8.05 |
| -23.900000000000002 | 7.05 |
| -24.7 | 7.85 |
| -24.8 | 7.35 |
| -24.400000000000002 | 7.45 |
| -23.0 | 8.55 |
| -24.5 | 8.35 |
| -23.900000000000002 | 6.25 |
| -22.8 | 5.05 |
| -24.5 | 4.55 |
| -22.7 | 5.05 |
| -22.2 | 6.15 |
| -25.5 | 7.05 |
| -26.1 | 6.05 |
| -19.1 | 6.05 |
| -22.7 | 5.55 |
| -24.2 | 4.35 |
| -24.580000000000002 | 4.12 |
| -25.01 | 3.6 |
| -21.14 | 6.43 |
| -21.22 | 6.8 |
| -22.71 | 6.92 |
| -22.76 | 7.01 |
| -24.580000000000002 | 3.02 |
| -23.23 | 7.09 |
| -23.66 | 7.34 |
| -23.61 | 7.64 |
| -21.93 | 5.98 |
| -21.45 | 4.02 |
| -21.46 | 3.98 |
| -22.19 | 6.17 |
| -24.240000000000002 | 3.19 |
| -23.09 | 3.52 |
| -24.220000000000002 | 3.04 |
| -24.060000000000002 | 2.02 |
| -24.060000000000002 | 2.24 |
| -24.59 | 4.14 |
| -24.07 | 3.45 |
| -23.060000000000002 | 3.78 |
| -23.13 | 4.31 |
| -24.05 | 4.33 |
| -22.970000000000002 | 4.07 |
| -22.0 | 5.61 |
| -22.740000000000002 | 6.9 |
| -25.240000000000002 | 3.88 |
| -24.32 | 4.31 |
| -24.68 | 2.43 |
| -17.61 | 6.38 |
| -23.11 | 4.31 |
| -23.89 | 4.28 |
| -23.98 | 3.22 |
| -24.0 | 2.83 |
| -22.900000000000002 | 5.65 |
| -23.14 | 5.41 |
| -23.05 | 5.47 |
| -23.53 | 4.03 |
| -23.61 | 4.01 |
| -24.3 | 4.01 |
| -23.080000000000002 | 4.72 |
| -23.87 | 2.32 |
| -23.89 | 2.23 |
| -23.28 | 3.86 |
| -23.35 | 3.96 |
| -22.19 | 4.93 |
| -24.39 | 3.84 |
| -23.970000000000002 | 4 |
| -23.93 | 3.49 |
| -22.470000000000002 | 8.5 |
| -24.470000000000002 | 4.29 |
| -23.830000000000002 | 4.31 |
| -24.01 | 4.2 |
| -23.52 | 6.36 |
| -24.060000000000002 | 5.07 |
| -22.86 | 8.74 |
| -25.52 | 4.83 |
| -23.470000000000002 | 2.37 |
| -23.71 | 3.88 |
| -23.77 | 3.26 |
| -23.240000000000002 | 4.41 |
| -23.93 | 1.26 |
| -22.78 | 4.91 |
| -24.400000000000002 | 2.74 |
| -23.85 | 3.11 |
| -23.5 | 3.3 |
| -24.28 | 4.33 |
| -23.64 | 4.05 |
| -22.970000000000002 | 4.32 |
| -23.330000000000002 | 4.4 |
| -24.45 | 1.46 |
| -24.23 | 4.11 |
| -22.580000000000002 | 6.6 |
| -21.95 | 4.27 |
| -22.42 | 4.53 |
| -23.07 | 4.71 |
| -24.810000000000002 | 4.55 |
| -21.68 | 5.57 |
| -21.7 | 3.92 |
| -23.060000000000002 | 3.99 |
| -24.55 | 3.07 |
| -24.51 | 1.54 |
| -22.63 | 4.87 |
| -24.25 | 2.56 |
| -24.45 | 2.28 |
| -22.92 | 3.96 |
| -24.14 | 4.2 |
| -23.82 | 4.68 |
| -23.41 | 4.27 |
| -24.07 | 5.02 |
| -23.75 | 4.78 |
| -23.92 | 5.18 |
| -23.060000000000002 | 6.11 |
| -23.080000000000002 | 6.08 |
| -23.330000000000002 | 4.56 |
| -23.900000000000002 | 5.76 |
| -24.220000000000002 | 3.66 |
| -22.94 | 4.48 |
| -24.01 | 4.17 |
| -23.14 | 4.35 |
| -22.87 | 4.24 |
| -24.36 | 3.82 |
| -22.57 | 2.64 |
| -23.77 | 4.16 |
| -24.12 | 2.43 |
| -23.38 | 4.92 |
| -23.970000000000002 | 3.81 |
| -23.54 | 4.33 |
| -22.88 | 5.35 |
| -21.66 | 5.14 |
| -23.34 | 4.39 |
| -23.3 | 4.32 |
| -23.740000000000002 | 3.1 |
| -24.16 | 4.65 |
| -24.43 | 3.33 |
| -24.490000000000002 | 1.43 |
| -23.71 | 4.92 |
| -24.79 | 3.64 |
| -23.310000000000002 | 3.75 |
| -23.93 | 3.7 |
| -21.2 | 7.47 |
| -22.95 | 4.51 |
| -22.91 | 6.38 |
| -23.02 | 6.17 |
| -23.02 | 3.2 |
| -22.580000000000002 | 6.93 |
| -23.6 | 7.45 |
| -22.7 | 6.75 |
| -23.7 | 7.15 |
| -24.3 | 7.65 |
| -23.1 | 6.65 |
| -26.0 | 5.15 |
| -25.900000000000002 | 6.15 |
| -26.400000000000002 | 5.95 |
| -26.0 | 6.65 |
| -25.900000000000002 | 4.65 |
| -18.4 | 8.05 |
| -16.5 | 8.35 |
| -16.4 | 5.55 |
| -17.1 | 7.05 |
| -16.8 | 4.55 |
| -12.84 | 5.25 |
| -13.0 | 4.35 |
| -14.2 | 3.85 |
| -12.0 | 4.45 |
| -12.899999999999999 | 6.15 |
| -13.2 | 3.02 |
| -12.5 | 3.25 |
| -12.5 | 1.85 |
| -13.5 | 2.85 |
| -15.7 | 3.15 |
| -14.7 | 3.05 |
| -13.7 | 4.25 |
| -13.6 | 5.15 |
| -12.399999999999999 | 5.45 |
| -12.8 | 4.95 |
| -12.3 | 3.55 |
| -15.600000000000001 | 2.75 |
| -16.8 | 1.95 |
| -17.4 | 1.45 |
| -15.5 | 0.55 |
| -15.399999999999999 | 1.75 |
| -13.2 | 1.85 |
| -12.399999999999999 | 2.35 |
| -11.8 | 3.15 |
| -11.899999999999999 | 5.65 |
| -12.7 | 3.45 |
| -13.0 | 4.75 |
| -13.3 | 4.65 |
| -12.5 | 6.15 |
| -12.899999999999999 | 4.15 |
| -15.3 | 2.15 |
| -15.3 | 2.85 |
| -14.2 | 3.05 |
| -15.100000000000001 | 3.05 |
| -13.2 | -0.05 |
| -15.7 | 2.15 |
| -19.4 | 7.25 |
| -18.7 | 3.85 |
| -19.6 | 5.45 |
| -19.9 | 6.75 |
| -14.100000000000001 | 2.55 |
| -12.399999999999999 | 3.95 |
| -13.2 | 1.95 |
| -15.399999999999999 | 6.75 |
| -12.6 | 4.25 |
| -12.19 | 3.41 |
| -23.659 | 1.339 |
| -21.607999999999997 | 3.337 |
| -21.520999999999997 | 3.665 |
| -21.198999999999998 | 3.751 |
| -21.299999999999997 | 3.866 |
| -21.747999999999998 | 3.97 |
| -22.578 | 3.951 |
| -22.482999999999997 | 4.158 |
| -20.253 | 3.659 |
| -20.378 | 3.961 |
| -20.127 | 4.171 |
| -19.288999999999998 | 4.361 |
| -20.0 | 4.549 |
| -20.255 | 4.862 |
| -21.852999999999998 | 5.672 |
| -22.27 | 4.669 |
| -22.691 | 4.568 |
| -23.317999999999998 | 4.367 |
| -23.866 | 4.264 |
| -24.494 | 4.461 |
| -24.253999999999998 | 2.756 |
| -23.982999999999997 | 2.857 |
| -23.413 | 2.807 |
| -23.131999999999998 | 3.061 |
| -24.086 | 3.055 |
| -24.087999999999997 | 3.258 |
| -24.182 | 3.36 |
| -23.665 | 3.352 |
| -24.081 | 3.559 |
| -22.906 | 3.456 |
| -24.08 | 3.958 |
| -24.709 | 4.061 |
| -25.238 | 3.765 |
| -24.706 | 4.358 |
| -19.81 | 4.564 |
| -19.191 | 5.271 |
| -21.837999999999997 | 4.959 |
| -24.214 | 5.668 |
| -23.772 | 6.571 |
| -22.91 | 6.883 |
| -20.665999999999997 | 6.075 |
| -22.971999999999998 | 8.036 |
| -18.012 | 5.167 |
| -18.006 | 5.281 |
| -23.654999999999998 | 1.334 |
| -21.599999999999998 | 12.45 |
| -21.2 | 9.15 |
| -21.299999999999997 | 10.75 |
| -21.599999999999998 | 9.85 |
| -22.299999999999997 | 12.25 |
| -22.2 | 8.85 |
| -21.799999999999997 | 12.05 |
| -21.9 | 8.95 |
| -21.0 | 11.55 |
| -21.299999999999997 | 11.35 |
| -23.0 | 9.15 |
| -20.9 | 8.75 |
| -22.0 | 9.35 |
| -22.099999999999998 | 9.65 |
| -21.9 | 8.75 |
| -22.7 | 6.75 |
| -22.299999999999997 | 6.95 |
| -22.5 | 8.55 |
| -21.799999999999997 | 9.75 |
| -22.4 | 7.45 |
| -22.599999999999998 | 9.25 |
| -22.599999999999998 | 8.35 |
| -23.2 | 6.35 |
| -21.9 | 9.45 |
| -23.4 | 6.75 |
| -21.5 | 10.35 |
| -22.4 | 8.35 |
| -22.799999999999997 | 9.55 |
| -22.4 | 8.65 |
| -22.099999999999998 | 7.65 |
| -21.799999999999997 | 9.95 |
| -22.0 | 6.55 |
| -21.599999999999998 | 9.65 |
| -21.599999999999998 | 11.75 |
| -21.799999999999997 | 6.15 |
| -22.2 | 9.25 |
| -22.599999999999998 | 5.95 |
| -22.799999999999997 | 8.35 |
| -21.5 | 7.85 |
| -22.5 | 6.25 |
| -21.599999999999998 | 9.35 |
| -22.2 | 6.55 |
| -21.7 | 9.85 |
| -21.599999999999998 | 10.55 |
| -22.0 | 7.75 |
| -23.299999999999997 | 8.85 |
| -23.0 | 6.35 |
| -23.0 | 7.05 |
| -23.4 | 8.05 |
| -22.5 | 9.95 |
| -21.5 | 8.05 |
| -22.7 | 7.35 |
| -20.9 | 8.25 |
| -21.299999999999997 | 10.55 |
| -20.9 | 7.95 |
| -22.299999999999997 | 7.45 |
| -22.299999999999997 | 6.85 |
| -23.4 | 5.55 |
| -21.799999999999997 | 7.85 |
| -22.299999999999997 | 8.25 |
| -23.2 | 5.35 |
| -22.4 | 8.55 |
| -21.5 | 7.35 |
| -22.299999999999997 | 10.35 |
| -21.9 | 7.75 |
| -22.5 | 7.95 |
| -22.5 | 6.85 |
| -21.599999999999998 | 8.35 |
| -21.2 | 10.85 |
| -22.9 | 6.35 |
| -22.0 | 7.55 |
| -21.9 | 6.25 |
| -22.5 | 5.25 |
| -22.2 | 7.25 |
| -22.599999999999998 | 4.85 |
| -21.099999999999998 | 8.15 |
| -23.599999999999998 | 3.25 |
| -22.099999999999998 | 4.85 |
| -21.299999999999997 | 7.05 |
| -22.4 | 6.35 |
| -23.0 | 8.55 |
| -22.799999999999997 | 7.65 |
| -22.2 | 6.65 |
| -22.599999999999998 | 6.95 |
| -22.4 | 7.95 |
| -21.4 | 7.45 |
| -22.099999999999998 | 8.55 |
| -22.0 | 8.55 |
| -21.4 | 10.45 |
| -23.87 | 6.82 |
| -23.53 | 6.55 |
| -23.299999999999997 | 6.25 |
| -23.0 | 4.85 |
| -25.3 | 5.05 |
| -25.0 | 5.95 |
| -25.7 | 4.85 |
| -25.8 | 5.25 |
| -25.7 | 6.05 |
| -25.5 | 6.45 |
| -25.5 | 5.75 |
| -26.2 | 7.05 |
| -25.900000000000002 | 5.35 |
| -25.0 | 5.65 |
| -25.900000000000002 | 7.45 |
| -24.7 | 6.45 |
| -25.0 | 7.35 |
| -25.6 | 7.05 |
| -25.6 | 4.75 |
| -24.900000000000002 | 6.65 |
| -26.0 | 6.65 |
| -25.1 | 4.55 |
| -25.2 | 5.75 |
| -24.900000000000002 | 5.75 |
| -24.7 | 6.95 |
| -25.6 | 6.55 |
| -26.2 | 5.75 |
| -26.2 | 8.05 |
| -25.400000000000002 | 5.85 |
| -24.8 | 7.05 |
| -25.900000000000002 | 6.85 |
| -25.6 | 6.25 |
| -25.7 | 5.85 |
| -24.400000000000002 | 7.25 |
| -25.3 | 7.85 |
| -25.6 | 5.75 |
| -25.1 | 6.45 |
| -24.2 | 6.55 |
| -25.6 | 4.65 |
| -25.6 | 5.75 |
| -26.0 | 6.35 |
| -25.6 | 7.35 |
| -25.6 | 6.25 |
| -25.0 | 6.45 |
| -25.8 | 5.65 |
| -25.5 | 6.45 |
| -25.7 | 5.15 |
| -26.0 | 6.05 |
| -25.3 | 5.05 |
| -26.1 | 6.55 |
| -25.7 | 6.45 |
| -25.8 | 5.45 |
| -25.6 | 7.05 |
| -25.6 | 6.15 |
| -25.1 | 6.95 |
| -25.900000000000002 | 4.95 |
| -25.5 | 5.75 |
| -24.5 | 6.75 |
| -25.7 | 6.55 |
| -25.6 | 7.05 |
| -23.900000000000002 | 6.75 |
| -25.5 | 6.25 |
| -25.400000000000002 | 6.35 |
| -25.8 | 5.85 |
| -25.7 | 5.35 |
| -24.8 | 2.75 |
| -25.3 | 5.85 |
| -25.5 | 4.55 |
| -26.0 | 5.95 |
| -25.8 | 7.15 |
| -25.7 | 5.85 |
| -25.3 | 5.75 |
| -24.6 | 4.05 |
| -25.2 | 5.05 |
| -25.2 | 3.35 |
| -25.3 | 3.05 |
| -25.0 | 3.85 |
| -25.8 | 4.35 |
| -25.0 | 4.85 |
| -25.5 | 2.85 |
| -25.1 | 4.35 |
| -25.2 | 4.95 |
| -25.2 | 3.75 |
| -25.7 | 3.05 |
| -25.1 | 3.75 |
| -25.3 | 4.25 |
| -25.7 | 3.75 |
| -25.3 | 4.95 |
| -24.8 | 3.85 |
| -24.1 | 5.25 |
| -26.0 | -0.55 |
| -25.8 | 3.65 |
| -24.900000000000002 | 5.15 |
| -25.6 | 5.45 |
| -25.6 | 4.85 |
| -23.900000000000002 | 2.25 |
| -24.8 | 3.45 |
| -25.1 | 4.15 |
| -24.2 | 5.55 |
| -24.1 | 4.35 |
| -24.7 | 3.05 |
| -24.0 | 2.35 |
| -24.7 | 0.75 |
| -24.3 | 2.85 |
| -22.3 | 4.35 |
| -23.8 | 3.95 |
| -20.9 | 5.75 |
| -23.3 | 5.25 |
| -18.3 | 7.75 |
| -22.3 | 4.85 |
| -20.6 | 6.85 |
| -22.3 | 5.55 |
| -22.2 | 5.05 |
| -23.400000000000002 | 4.75 |
| -21.5 | 6.55 |
| -23.5 | 4.85 |
| -19.4 | 8.75 |
| -22.0 | 7.45 |
| -18.9 | 11.25 |
| -22.1 | 5.65 |
| -22.7 | 6.35 |
| -20.5 | 6.35 |
| -21.8 | 7.55 |
| -21.3 | 9.85 |
| -20.6 | 14.35 |
| -20.9 | 11.85 |
| -21.2 | 12.45 |
| -21.1 | 10.85 |
| -21.2 | 10.65 |
| -20.4 | 10.85 |
| -20.9 | 11.65 |
| -19.2 | 19.75 |
| -22.3 | 4.85 |
| -22.900000000000002 | 5.15 |
| -22.2 | 10.75 |
| -20.9 | 11.45 |
| -20.5 | 11.65 |
| -22.900000000000002 | 9.95 |
| -20.6 | 14.15 |
| -21.8 | 9.25 |
| -20.4 | 6.25 |
| -21.6 | 10.65 |
| -21.8 | 12.95 |
| -21.3 | 10.35 |
| -21.8 | 10.45 |
| -22.7 | 10.65 |
| -22.2 | 13.35 |
| -21.2 | 13.05 |
| -20.8 | 13.55 |
| -19.3 | 4.25 |
| -19.3 | 4.05 |
| -20.9 | 4.95 |
| -21.1 | 2.55 |
| -22.2 | 2.25 |
| -20.3 | 6.45 |
| -20.9 | 7.25 |
| -20.8 | 4.45 |
| -19.9 | 4.05 |
| -19.4 | 5.65 |
| -22.3 | 5.45 |
| -20.2 | 4.45 |
| -20.6 | 4.05 |
| -19.6 | 5.05 |
| -20.4 | 4.85 |
| -19.6 | 4.75 |
| -19.7 | 4.65 |
| -19.9 | 4.85 |
| -20.7 | 4.05 |
| -20.9 | 3.75 |
| -21.8 | 4.85 |
| -22.5 | 4.15 |
| -19.099999999999998 | 5.75 |
| -20.099999999999998 | 10.65 |
| -20.3 | 10.45 |
| -19.9 | 8.95 |
| -19.9 | 8.05 |
| -19.0 | 12.05 |
| -19.0 | 11.85 |
| -19.8 | 10.35 |
| -19.7 | 10.55 |
| -19.8 | 9.95 |
| -20.3 | 9.25 |
| -20.4 | 10.55 |
| -19.0 | 9.25 |
| -18.4 | 11.65 |
| -19.9 | 10.65 |
| -20.7 | 9.05 |
| -19.4 | 12.05 |
| -19.5 | 8.95 |
| -19.8 | 9.95 |
| -19.599999999999998 | 8.35 |
| -20.099999999999998 | 11.25 |
| -18.5 | 10.75 |
| -18.0 | 12.15 |
| -19.5 | 10.65 |
| -18.7 | 1.45 |
| -18.9 | 3.25 |
| -19.2 | 3.85 |
| -21.3 | 2.95 |
| -18.4 | 7.15 |
| -18.7 | 7.55 |
| -18.2 | 5.85 |
| -18.6 | 3.95 |
| -20.0 | 3.55 |
| -20.8 | 2.65 |
| -18.2 | 2.05 |
| -19.4 | 3.25 |
| -18.4 | 4.25 |
| -18.6 | 4.35 |
| -19.6 | 2.25 |
| -19.7 | 2.05 |
| -19.1 | 3.45 |
| -17.8 | 4.15 |
| -19.7 | 1.75 |
| -19.8 | 1.45 |
| -19.5 | 2.65 |
| -20.5 | 1.75 |
| -19.3 | 1.65 |
| -19.6 | 3.75 |
| -20.0 | 3.45 |
| -21.0 | 6.55 |
| -20.0 | 5.65 |
| -19.0 | 4.05 |
| -17.5 | 5.05 |
| -17.0 | 2.75 |
| -18.3 | 3.15 |
| -19.7 | 1.35 |
| -20.599999999999998 | 1.85 |
| -18.200000000000003 | 4.25 |
| -18.3 | 2.45 |
| -19.4 | 6.05 |
| -17.5 | 4.55 |
| -17.9 | 4.05 |
| -21.7 | 3.05 |
| -18.200000000000003 | 4.75 |
| -18.5 | 5.55 |
| -23.7 | 6.05 |
| -24.1 | 5.85 |
| -21.7 | 6.55 |
| -27.1 | 5.75 |
| -26.1 | 6.45 |
| -25.900000000000002 | 5.95 |
| -25.7 | 5.65 |
| -26.6 | 5.05 |
| -23.900000000000002 | 7.15 |
| -23.0 | 5.85 |
| -26.0 | 5.45 |
| -25.8 | 5.55 |
| -22.900000000000002 | 5.85 |
| -25.2 | 4.65 |
| -24.900000000000002 | 6.25 |
| -24.96 | 6.65 |
| -25.66 | 6.25 |
| -26.53 | 6.65 |
| -24.36 | 6.75 |
| -27.8 | 1.95 |
| -26.1 | 4.45 |
| -20.5 | 1.35 |
| -23.7 | 5.15 |
| -23.7 | 4.75 |
| -23.7 | 4.85 |
| -19.3 | 7.15 |
| -22.3 | 5.35 |
| -22.3 | 7.15 |
| -23.2 | 2.85 |
| -22.0 | 1.85 |
| -23.5 | 2.05 |
| -24.6 | 0.35 |
| -21.7 | 6.25 |
| -23.3 | 3.65 |
| -19.5 | 1.15 |
| -24.900000000000002 | 2.25 |
| -24.0 | 5.05 |
| -24.6 | 2.75 |
| -24.3 | 3.85 |
| -24.1 | 5.45 |
| -24.1 | 4.05 |
| -23.1 | 5.65 |
| -25.2 | 1.95 |
| -24.3 | 4.45 |
| -21.6 | 5.25 |
| -20.0 | 4.85 |
| -21.3 | 3.45 |
| -22.3 | 6.85 |
| -26.7 | 5.85 |
| -23.0 | 1.65 |
| -21.7 | 5.35 |
| -22.900000000000002 | 3.85 |
| -24.7 | 3.95 |
| -23.0 | 4.15 |
| -22.5 | 6.55 |
| -21.0 | 4.15 |
| -21.8 | 5.85 |
| -18.1 | 3.85 |
| -19.6 | 4.05 |
| -19.1 | 3.45 |
| -19.6 | 3.45 |
| -21.1 | 4.75 |
| -23.1 | 2.05 |
| -23.1 | 3.65 |
| -16.6 | 4.35 |
| -16.6 | 1.95 |
| -23.8 | 3.85 |
| -16.8 | 3.95 |
| -21.7 | 0.85 |
| -21.4 | 3.85 |
| -19.3 | 3.75 |
| -22.2 | 3.65 |
| -17.7 | 3.55 |
| -17.9 | 4.05 |
| -18.2 | 3.75 |
| -17.0 | 1.75 |
| -20.7 | 5.65 |
| -24.5 | 2.35 |
| -23.7 | 4.65 |
| -23.0 | 4.25 |
| -20.3 | 4.35 |
| -20.1 | 5.45 |
| -20.1 | 5.25 |
| -21.5 | 5.55 |
| -22.7 | 2.65 |
| -20.6 | 2.95 |
| -20.8 | 3.75 |
| -19.8 | 4.75 |
| -19.5 | 3.85 |
| -22.6 | 4.55 |
| -23.2 | 3.75 |
| -22.1 | 3.85 |
| -21.8 | 4.85 |
| -23.400000000000002 | 5.65 |
| -21.4 | 2.65 |
| -19.6 | 3.35 |
| -21.0 | 3.45 |
| -19.7 | 3.15 |
| -19.3 | 4.25 |
| -24.0 | 6.35 |
| -21.900000000000002 | 3.55 |
| -17.2 | 15.75 |
| -16.3 | 13.55 |
| -17.2 | 16.35 |
| -17.9 | 12.25 |
| -17.2 | 17.75 |
| -17.8 | 17.05 |
| -21.5 | 4.65 |
| -22.7 | 4.75 |
| -21.5 | 4.05 |
| -21.5 | 3.85 |
| -21.3 | 3.85 |
| -26.2 | 4.65 |
| -24.400000000000002 | 8.65 |
| -17.6 | 18.35 |
| -16.7 | 21.05 |
| -17.8 | 18.55 |
| -17.7 | 17.65 |
| -17.4 | 18.05 |
| -17.8 | 19.65 |
| -17.1 | 18.85 |
| -18.7 | 15.95 |
| -16.6 | 16.75 |
| -17.1 | 17.65 |
| -17.1 | 17.15 |
| -17.1 | 18.65 |
| -17.0 | 15.55 |
| -16.8 | 18.25 |
| -18.1 | 17.95 |
| -18.4 | 18.65 |
| -16.5 | 17.75 |
| -18.0 | 17.85 |
| -19.0 | 17.85 |
| -16.8 | 16.55 |
| -16.9 | 18.25 |
| -18.8 | 18.55 |
| -17.2 | 17.85 |
| -17.2 | 18.05 |
| -17.2 | 17.55 |
| -17.3 | 17.65 |
| -17.3 | 17.55 |
| -16.6 | 18.55 |
| -16.8 | 17.05 |
| -17.2 | 17.05 |
| -17.5 | 19.85 |
| -17.9 | 20.65 |
| -17.2 | 19.75 |
| -17.7 | 20.15 |
| -18.2 | 21.05 |
| -25.2 | 5.05 |
| -25.5 | 5.35 |
| -25.2 | 5.15 |
| -25.2 | 5.25 |
| -25.5 | 5.15 |
| -25.7 | 5.25 |
| -22.400000000000002 | 5.15 |
| -23.2 | 7.25 |
| -24.1 | 6.85 |
| -21.3 | 8.35 |
| -22.0 | 8.55 |
| -22.8 | 2.25 |
| -22.7 | 9.35 |
| -23.2 | 4.55 |
| -21.3 | 5.55 |
| -24.5 | 4.85 |
| -23.7 | 5.35 |
| -22.900000000000002 | 5.35 |
| -25.2 | 3.95 |
| -23.8 | 5.75 |
| -25.1 | 3.55 |
| -24.400000000000002 | 4.85 |
| -23.900000000000002 | 8.45 |
| -23.5 | 4.55 |
| -24.3 | 3.95 |
| -24.2 | 4.95 |
| -23.8 | 3.95 |
| -21.900000000000002 | 10.25 |
| -21.900000000000002 | 10.65 |
| -22.400000000000002 | 5.65 |
| -22.0 | 9.35 |
| -22.900000000000002 | 3.75 |
| -21.900000000000002 | 11.25 |
| -22.1 | 10.55 |
| -22.6 | 10.65 |
| -21.8 | 11.35 |
| -23.8 | 0.75 |
| -22.2 | 3.65 |
| -21.7 | 10.45 |
| -18.2 | 19.25 |
| -18.1 | 19.15 |
| -19.1 | 21.85 |
| -18.6 | 18.95 |
| -17.7 | 21.65 |
| -16.7 | 16.45 |
| -17.7 | 18.55 |
| -18.4 | 17.25 |
| -19.2 | 16.55 |
| -18.0 | 18.95 |
| -19.2 | 17.55 |
| -19.7 | 13.65 |
| -20.5 | 11.25 |
| -18.2 | 20.65 |
| -19.2 | 18.65 |
| -23.7 | -2.15 |
| -25.0 | 1.55 |
| -25.900000000000002 | -0.55 |
| -25.6 | -1.75 |
| -26.1 | -2.25 |
| -26.1 | -1.95 |
| -26.0 | -1.95 |
| -25.400000000000002 | -0.85 |
| -25.5 | -2.25 |
| -24.400000000000002 | 1.55 |
| -25.5 | 0.25 |
| -22.8 | -0.25 |
| -23.400000000000002 | -1.15 |
| -21.900000000000002 | -1.05 |
| -19.4 | -0.35 |
| -19.0 | 0.15 |
| -18.6 | -0.35 |
| -18.6 | 1.45 |
| -19.8 | 0.85 |
| -19.7 | 0.35 |
| -20.5 | -0.95 |
| -19.8 | -0.45 |
| -19.5 | -1.05 |
| -18.5 | -0.35 |
| -16.1 | 1.45 |
| -18.5 | 0.65 |
| -18.2 | 1.05 |
| -17.8 | 0.25 |
| -18.0 | 1.45 |
| -16.5 | 2.05 |
| -16.2 | 1.45 |
| -18.3 | -1.05 |
| -17.8 | -0.25 |
| -16.6 | 0.55 |
| -17.4 | 1.55 |
| -17.6 | -0.35 |
| -16.4 | 1.35 |
| -17.2 | 2.05 |
| -18.6 | 1.25 |
| -17.7 | -0.35 |
| -17.5 | -0.45 |
| -17.1 | -0.45 |
| -19.3 | 2.45 |
| -19.3 | 0.55 |
| -18.6 | -0.25 |
| -18.6 | -1.25 |
| -18.1 | -0.65 |
| -18.9 | -1.25 |
| -21.1 | -0.55 |
| -18.7 | -0.15 |
| -17.4 | 0.45 |
| -20.5 | -0.15 |
| -19.2 | -0.35 |
| -16.3 | 0.95 |
| -20.2 | -0.25 |
| -19.2 | -1.65 |
| -18.8 | 0.35 |
| -25.2 | 2.95 |
| -25.6 | 0.95 |
| -24.8 | 2.95 |
| -23.3 | 5.25 |
| -23.2 | 5.15 |
| -22.400000000000002 | 3.35 |
| -23.2 | 3.75 |
| -25.7 | 1.05 |
| -24.5 | 2.15 |
| -23.5 | 4.85 |
| -23.6 | 5.65 |
| -21.1 | 3.55 |
| -19.7 | 4.65 |
| -19.3 | 6.55 |
| -20.6 | 5.25 |
| -21.4 | 3.75 |
| -21.4 | 4.45 |
| -20.5 | 1.65 |
| -22.0 | 6.25 |
| -19.4 | 2.35 |
| -20.1 | 2.45 |
| -19.3 | 2.05 |
| -18.2 | 5.15 |
| -18.1 | 4.25 |
| -23.1 | 8.25 |
| -19.0 | 2.15 |
| -16.5 | 5.55 |
| -17.9 | 18.55 |
| -17.2 | 19.65 |
| -17.8 | 20.05 |
| -17.6 | 19.65 |
| -17.1 | 19.05 |
| -19.0 | 5.85 |
| -20.6 | 4.55 |
| -21.1 | 5.55 |
| -23.2 | 5.35 |
| -21.5 | 5.95 |
| -19.4 | 5.05 |
| -20.3 | 5.35 |
| -21.1 | 4.05 |
| -19.6 | 5.15 |
| -20.8 | 5.35 |
| -20.0 | 4.95 |
| -20.6 | 3.45 |
| -21.3 | 4.55 |
| -20.6 | 4.55 |
| -19.5 | 5.55 |
| -17.4 | 5.45 |
| -21.1 | 4.75 |
| -19.4 | 5.35 |
| -18.7 | 6.85 |
| -19.5 | 6.05 |
| -18.0 | 8.75 |
| -17.4 | 8.15 |
| -18.7 | 9.35 |
| -20.0 | 5.45 |
| -20.9 | 4.85 |
| -20.3 | 5.05 |
| -19.9 | 5.65 |
| -20.7 | 4.75 |
| -20.4 | 4.95 |
| -20.2 | 5.15 |
| -21.3 | 4.45 |
| -19.0 | 6.65 |
| -22.400000000000002 | 1.25 |
| -20.4 | 7.55 |
| -20.3 | 6.85 |
| -18.6 | 20.05 |
| -17.2 | 20.55 |
| -17.1 | 18.95 |
| -17.7 | 21.35 |
| -15.0 | 15.85 |
| -17.4 | 20.15 |
| -17.9 | 20.05 |
| -19.5 | 18.75 |
| -17.1 | 18.35 |
| -15.5 | 20.75 |
| -16.0 | 8.95 |
| -19.4 | 7.85 |
| -16.3 | 16.85 |
| -15.0 | 9.45 |
| -15.7 | 7.35 |
| -24.400000000000002 | 4.85 |
| -14.600000000000001 | 16.85 |
| -17.7 | 15.15 |
| -19.9 | 18.35 |
| -15.2 | 12.35 |
| -15.3 | 17.25 |
| -15.100000000000001 | 8.45 |
| -19.7 | 6.75 |
| -15.7 | 9.95 |
| -15.600000000000001 | 6.95 |
| -14.5 | 15.75 |
| -16.6 | 10.15 |
| -15.0 | 9.25 |
| -15.7 | 13.55 |
| -14.399999999999999 | 9.25 |
| -15.8 | 9.35 |
| -15.3 | 7.25 |
| -14.5 | 11.25 |
| -17.8 | 14.45 |
| -13.7 | 15.95 |
| -15.8 | 7.15 |
| -15.8 | 8.15 |
| -14.8 | 15.45 |
| -14.600000000000001 | 15.45 |
| -16.3 | 8.15 |
| -15.899999999999999 | 18.05 |
| -18.1 | 18.15 |
| -19.1 | 14.25 |
| -15.100000000000001 | 10.55 |
| -15.7 | 8.15 |
| -16.1 | 14.25 |
| -23.8 | 8.45 |
| -24.900000000000002 | 8.75 |
| -24.2 | 7.55 |
| -23.7 | 8.85 |
| -23.8 | 9.05 |
| -21.900000000000002 | 8.55 |
| -23.6 | 9.05 |
| -27.900000000000002 | 7.45 |
| -22.6 | 9.15 |
| -25.3 | 7.55 |
| -23.6 | 8.55 |
| -23.6 | 8.65 |
| -21.8 | 7.25 |
| -23.400000000000002 | 9.15 |
| -23.6 | 7.15 |
| -20.8 | 7.65 |
| -18.6 | 7.25 |
| -19.7 | 7.05 |
| -20.8 | 8.75 |
| -21.4 | 8.35 |
| -21.5 | 9.65 |
| -19.9 | 7.75 |
| -20.0 | 8.05 |
| -20.9 | 8.95 |
| -18.0 | 6.75 |
| -21.3 | 8.15 |
| -21.5 | 6.85 |
| -21.6 | 7.65 |
| -23.5 | 7.35 |
| -22.7 | 6.95 |
| -22.2 | 7.75 |
| -22.1 | 7.25 |
| -23.1 | 7.45 |
| -21.900000000000002 | 6.55 |
| -21.8 | 5.85 |
| -21.7 | 6.45 |
| -22.2 | 6.25 |
| -21.900000000000002 | 6.05 |
| -21.900000000000002 | 6.55 |
| -21.8 | 7.45 |
| -21.2 | 5.55 |
| -17.22 | 7.19 |
| -16.1 | 7.71 |
| -17.0 | 7.41 |
| -19.9 | 8.55 |
| -25.400000000000002 | 1.45 |
| -25.0 | 3.55 |
| -24.400000000000002 | 3.65 |
| -24.1 | 5.55 |
| -26.400000000000002 | 1.25 |
| -25.7 | 3.05 |
| -25.7 | 1.55 |
| -25.7 | 4.15 |
| -25.6 | 1.75 |
| -25.6 | 2.05 |
| -25.400000000000002 | 2.45 |
| -25.2 | 6.55 |
| -25.2 | 5.45 |
| -25.1 | 3.35 |
| -25.0 | 4.55 |
| -24.900000000000002 | 2.45 |
| -24.900000000000002 | 2.85 |
| -24.900000000000002 | 3.55 |
| -24.900000000000002 | 2.45 |
| -24.8 | 1.95 |
| -24.8 | 2.85 |
| -24.8 | 3.05 |
| -24.7 | 3.85 |
| -24.7 | 4.35 |
| -24.7 | 3.95 |
| -24.7 | 3.75 |
| -24.6 | 4.75 |
| -24.6 | 3.95 |
| -24.5 | 2.95 |
| -24.5 | 5.45 |
| -24.5 | 3.95 |
| -24.5 | 4.95 |
| -24.5 | 4.75 |
| -24.5 | 3.25 |
| -24.400000000000002 | 5.15 |
| -24.400000000000002 | 2.65 |
| -24.3 | 4.25 |
| -24.3 | 3.15 |
| -24.0 | 2.45 |
| -26.400000000000002 | 4.95 |
| -25.6 | 3.25 |
| -25.400000000000002 | 3.25 |
| -25.1 | 1.75 |
| -25.0 | 3.65 |
| -24.900000000000002 | 4.55 |
| -24.900000000000002 | 2.95 |
| -24.8 | 3.85 |
| -24.8 | 4.55 |
| -24.7 | 2.95 |
| -24.7 | 2.15 |
| -24.6 | 3.65 |
| -24.400000000000002 | 3.35 |
| -24.400000000000002 | 3.25 |
| -24.1 | 5.05 |
| -23.5 | 5.85 |
| -25.6 | 3.25 |
| -25.400000000000002 | 3.25 |
| -25.1 | 1.75 |
| -25.0 | 3.65 |
| -24.900000000000002 | 4.55 |
| -24.900000000000002 | 2.95 |
| -24.8 | 3.85 |
| -24.8 | 4.55 |
| -24.7 | 2.95 |
| -24.7 | 2.15 |
| -24.6 | 3.65 |
| -24.400000000000002 | 3.35 |
| -24.400000000000002 | 3.25 |
| -24.1 | 5.05 |
| -23.5 | 5.85 |